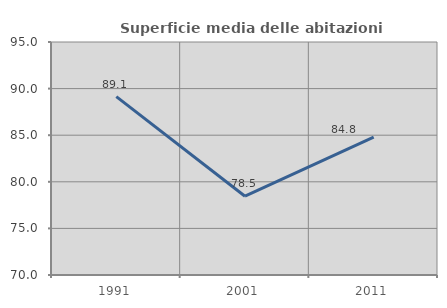
| Category | Superficie media delle abitazioni occupate |
|---|---|
| 1991.0 | 89.142 |
| 2001.0 | 78.455 |
| 2011.0 | 84.8 |